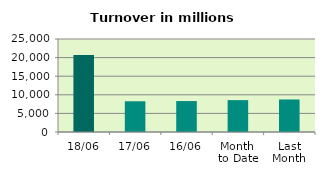
| Category | Series 0 |
|---|---|
| 18/06 | 20679.518 |
| 17/06 | 8262.249 |
| 16/06 | 8316.549 |
| Month 
to Date | 8565.792 |
| Last
Month | 8745.898 |